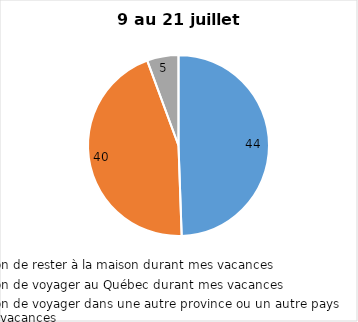
| Category | Series 0 |
|---|---|
| J’ai l’intention de rester à la maison durant mes vacances | 44 |
| J’ai l’intention de voyager au Québec durant mes vacances | 40 |
| J’ai l’intention de voyager dans une autre province ou un autre pays durant mes vacances | 5 |